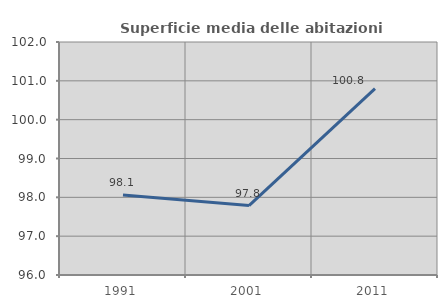
| Category | Superficie media delle abitazioni occupate |
|---|---|
| 1991.0 | 98.061 |
| 2001.0 | 97.788 |
| 2011.0 | 100.799 |